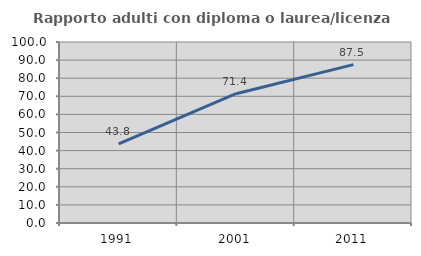
| Category | Rapporto adulti con diploma o laurea/licenza media  |
|---|---|
| 1991.0 | 43.75 |
| 2001.0 | 71.429 |
| 2011.0 | 87.5 |